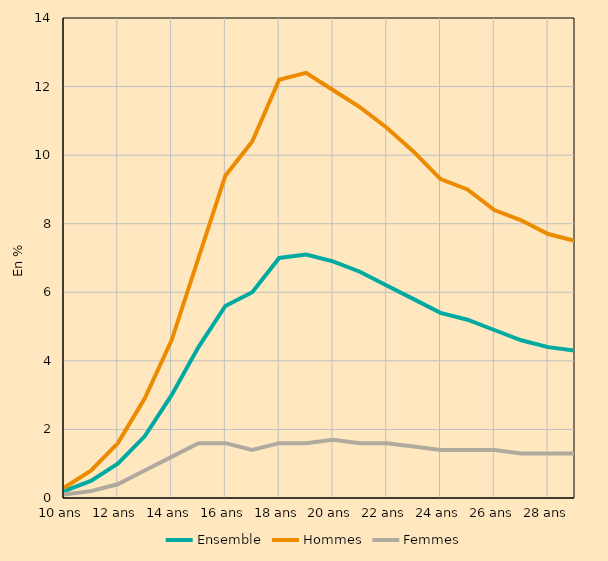
| Category | Ensemble | Hommes | Femmes |
|---|---|---|---|
| 10 ans | 0.2 | 0.3 | 0.1 |
| 11 ans | 0.5 | 0.8 | 0.2 |
| 12 ans | 1 | 1.6 | 0.4 |
| 13 ans | 1.8 | 2.9 | 0.8 |
| 14 ans | 3 | 4.6 | 1.2 |
| 15 ans | 4.4 | 7 | 1.6 |
| 16 ans | 5.6 | 9.4 | 1.6 |
| 17 ans | 6 | 10.4 | 1.4 |
| 18 ans | 7 | 12.2 | 1.6 |
| 19 ans | 7.1 | 12.4 | 1.6 |
| 20 ans | 6.9 | 11.9 | 1.7 |
| 21 ans | 6.6 | 11.4 | 1.6 |
| 22 ans | 6.2 | 10.8 | 1.6 |
| 23 ans | 5.8 | 10.1 | 1.5 |
| 24 ans | 5.4 | 9.3 | 1.4 |
| 25 ans | 5.2 | 9 | 1.4 |
| 26 ans | 4.9 | 8.4 | 1.4 |
| 27 ans | 4.6 | 8.1 | 1.3 |
| 28 ans | 4.4 | 7.7 | 1.3 |
| 29 ans | 4.3 | 7.5 | 1.3 |